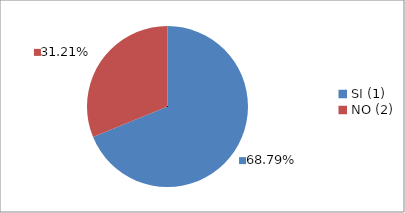
| Category | Series 0 |
|---|---|
| SI (1) | 0.688 |
| NO (2) | 0.312 |